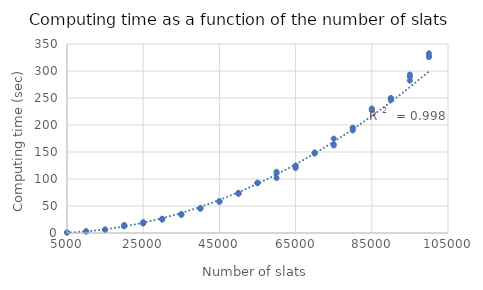
| Category | Series 0 |
|---|---|
| 5000.0 | 0.877 |
| 5000.0 | 0.945 |
| 5000.0 | 0.9 |
| 10000.0 | 3.037 |
| 10000.0 | 2.996 |
| 10000.0 | 2.922 |
| 15000.0 | 6.131 |
| 15000.0 | 6.363 |
| 15000.0 | 6.011 |
| 20000.0 | 14.892 |
| 20000.0 | 12.634 |
| 20000.0 | 12.634 |
| 25000.0 | 20.263 |
| 25000.0 | 17.647 |
| 25000.0 | 17.911 |
| 30000.0 | 26.044 |
| 30000.0 | 26.452 |
| 30000.0 | 24.675 |
| 35000.0 | 33.939 |
| 35000.0 | 35.375 |
| 35000.0 | 33.875 |
| 40000.0 | 44.757 |
| 40000.0 | 46.024 |
| 40000.0 | 45.906 |
| 45000.0 | 57.799 |
| 45000.0 | 58.473 |
| 45000.0 | 58.845 |
| 50000.0 | 72.931 |
| 50000.0 | 72.725 |
| 50000.0 | 74.398 |
| 55000.0 | 92.762 |
| 55000.0 | 92.172 |
| 55000.0 | 93.217 |
| 60000.0 | 110.573 |
| 60000.0 | 113.42 |
| 60000.0 | 101.733 |
| 65000.0 | 120.356 |
| 65000.0 | 122.935 |
| 65000.0 | 125.066 |
| 70000.0 | 148.281 |
| 70000.0 | 147.022 |
| 70000.0 | 149.216 |
| 75000.0 | 174.795 |
| 75000.0 | 161.985 |
| 75000.0 | 164.652 |
| 80000.0 | 189.868 |
| 80000.0 | 194.322 |
| 80000.0 | 195.252 |
| 85000.0 | 227.198 |
| 85000.0 | 228.689 |
| 85000.0 | 230.663 |
| 90000.0 | 250.109 |
| 90000.0 | 245.81 |
| 90000.0 | 249.02 |
| 95000.0 | 282.087 |
| 95000.0 | 289.001 |
| 95000.0 | 293.531 |
| 100000.0 | 325.723 |
| 100000.0 | 327.72 |
| 100000.0 | 332.767 |